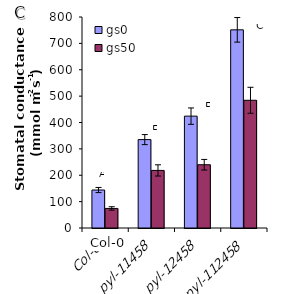
| Category | gs0 | gs50 |
|---|---|---|
| Col-0 | 143.988 | 74.166 |
| pyl-11458 | 335.164 | 218.322 |
| pyl-12458 | 424.141 | 239.861 |
| pyl-112458 | 751.32 | 484.269 |